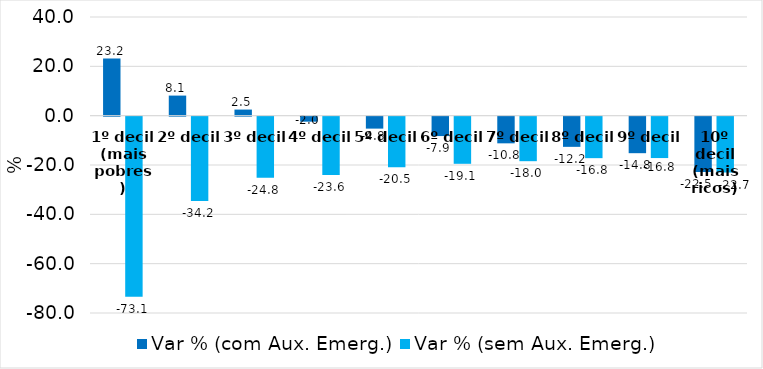
| Category | Var % (com Aux. Emerg.) | Var % (sem Aux. Emerg.) |
|---|---|---|
| 1º decil (mais pobres) | 23.173 | -73.053 |
| 2º decil | 8.141 | -34.193 |
| 3º decil | 2.472 | -24.776 |
| 4º decil | -2.029 | -23.626 |
| 5º decil | -4.845 | -20.472 |
| 6º decil | -7.861 | -19.108 |
| 7º decil | -10.811 | -18.05 |
| 8º decil | -12.234 | -16.823 |
| 9º decil | -14.807 | -16.782 |
| 10º decil (mais ricos) | -22.467 | -22.674 |